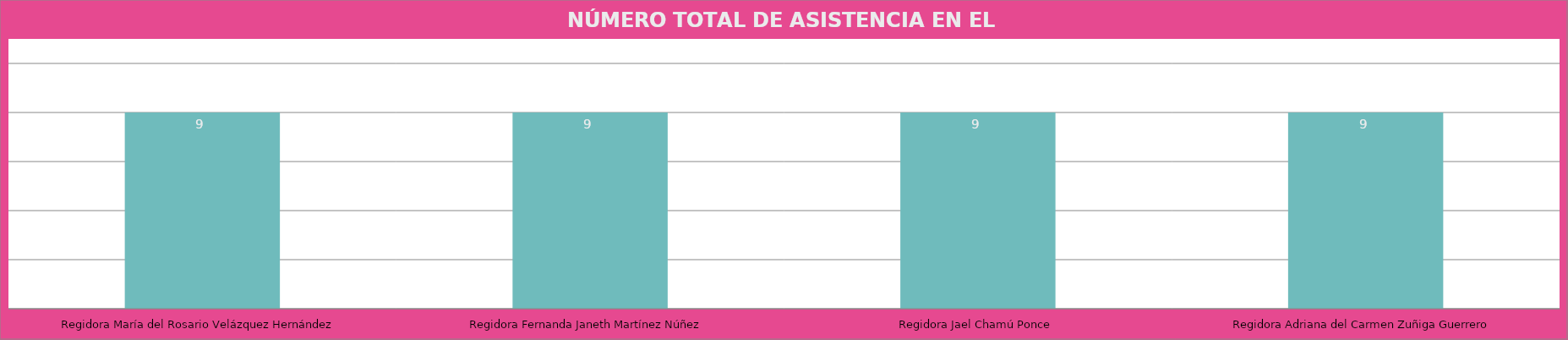
| Category | Regidora María del Rosario Velázquez Hernández |
|---|---|
| Regidora María del Rosario Velázquez Hernández | 9 |
| Regidora Fernanda Janeth Martínez Núñez | 9 |
| Regidora Jael Chamú Ponce | 9 |
| Regidora Adriana del Carmen Zuñiga Guerrero | 9 |